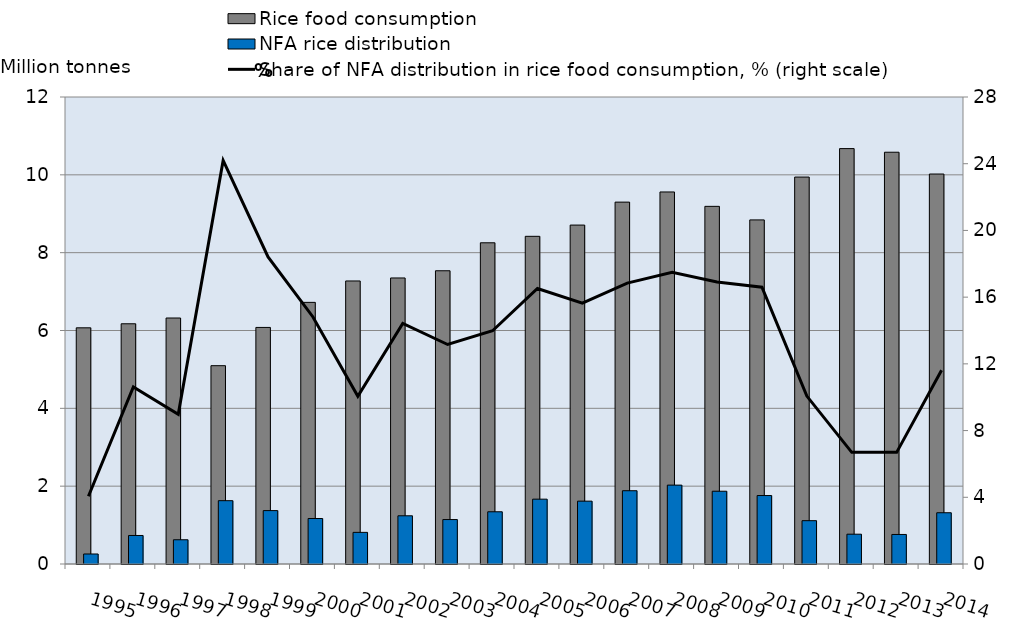
| Category | Rice food consumption | NFA rice distribution |
|---|---|---|
| 1995.0 | 6.069 | 0.257 |
| 1996.0 | 6.173 | 0.733 |
| 1997.0 | 6.321 | 0.623 |
| 1998.0 | 5.096 | 1.627 |
| 1999.0 | 6.079 | 1.372 |
| 2000.0 | 6.723 | 1.169 |
| 2001.0 | 7.273 | 0.813 |
| 2002.0 | 7.35 | 1.239 |
| 2003.0 | 7.535 | 1.142 |
| 2004.0 | 8.254 | 1.342 |
| 2005.0 | 8.42 | 1.666 |
| 2006.0 | 8.709 | 1.615 |
| 2007.0 | 9.299 | 1.883 |
| 2008.0 | 9.56 | 2.027 |
| 2009.0 | 9.19 | 1.87 |
| 2010.0 | 8.842 | 1.759 |
| 2011.0 | 9.943 | 1.113 |
| 2012.0 | 10.674 | 0.766 |
| 2013.0 | 10.581 | 0.759 |
| 2014.0 | 10.021 | 1.317 |